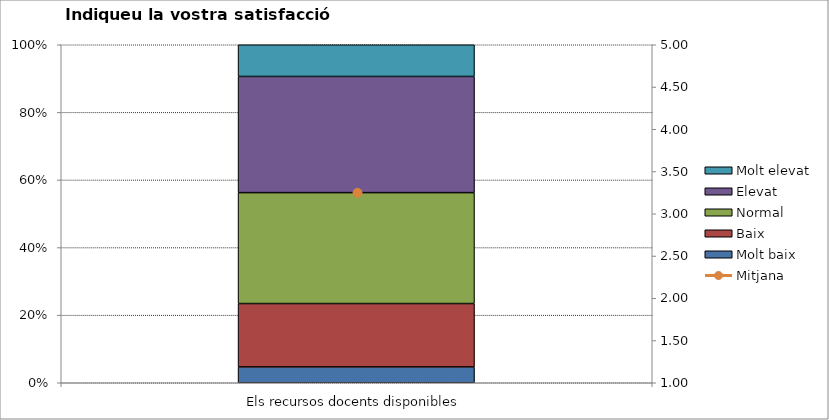
| Category | Molt baix | Baix | Normal  | Elevat | Molt elevat |
|---|---|---|---|---|---|
| Els recursos docents disponibles | 3 | 12 | 21 | 22 | 6 |